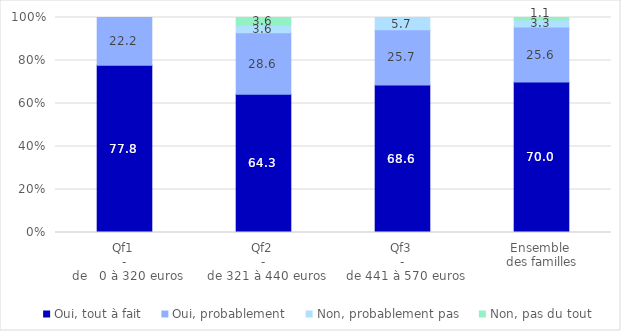
| Category | Oui, tout à fait | Oui, probablement | Non, probablement pas | Non, pas du tout |
|---|---|---|---|---|
| Qf1 
-
 de   0 à 320 euros | 77.778 | 22.222 | 0 | 0 |
| Qf2 
-
 de 321 à 440 euros | 64.286 | 28.571 | 3.571 | 3.571 |
| Qf3 
-
 de 441 à 570 euros | 68.571 | 25.714 | 5.714 | 0 |
| Ensemble 
des familles | 70 | 25.556 | 3.333 | 1.111 |